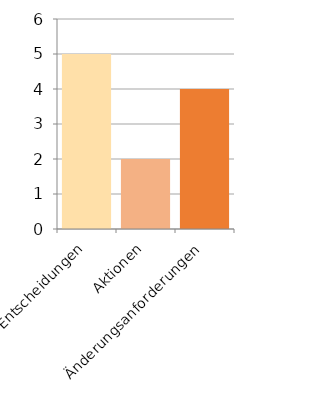
| Category | Series 0 |
|---|---|
| Entscheidungen | 5 |
| Aktionen | 2 |
| Änderungsanforderungen  | 4 |